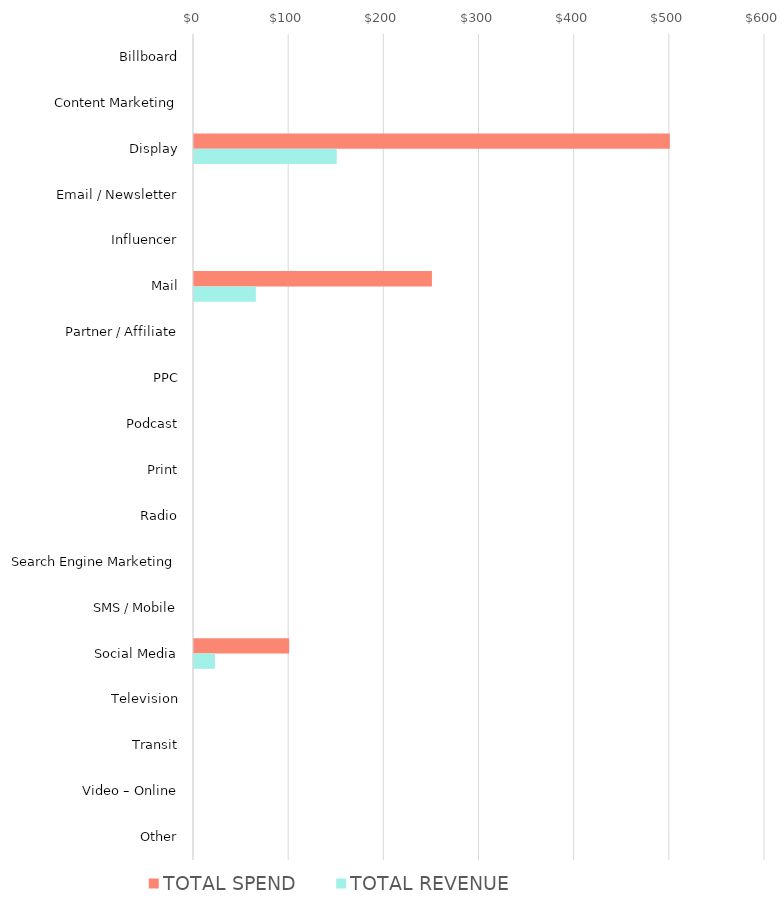
| Category | TOTAL SPEND | TOTAL REVENUE |
|---|---|---|
| Billboard | 0 | 0 |
| Content Marketing | 0 | 0 |
| Display | 500 | 150 |
| Email / Newsletter | 0 | 0 |
| Influencer | 0 | 0 |
| Mail | 250 | 65 |
| Partner / Affiliate | 0 | 0 |
| PPC | 0 | 0 |
| Podcast | 0 | 0 |
| Print | 0 | 0 |
| Radio | 0 | 0 |
| Search Engine Marketing | 0 | 0 |
| SMS / Mobile | 0 | 0 |
| Social Media | 100 | 22 |
| Television | 0 | 0 |
| Transit | 0 | 0 |
| Video – Online | 0 | 0 |
| Other | 0 | 0 |